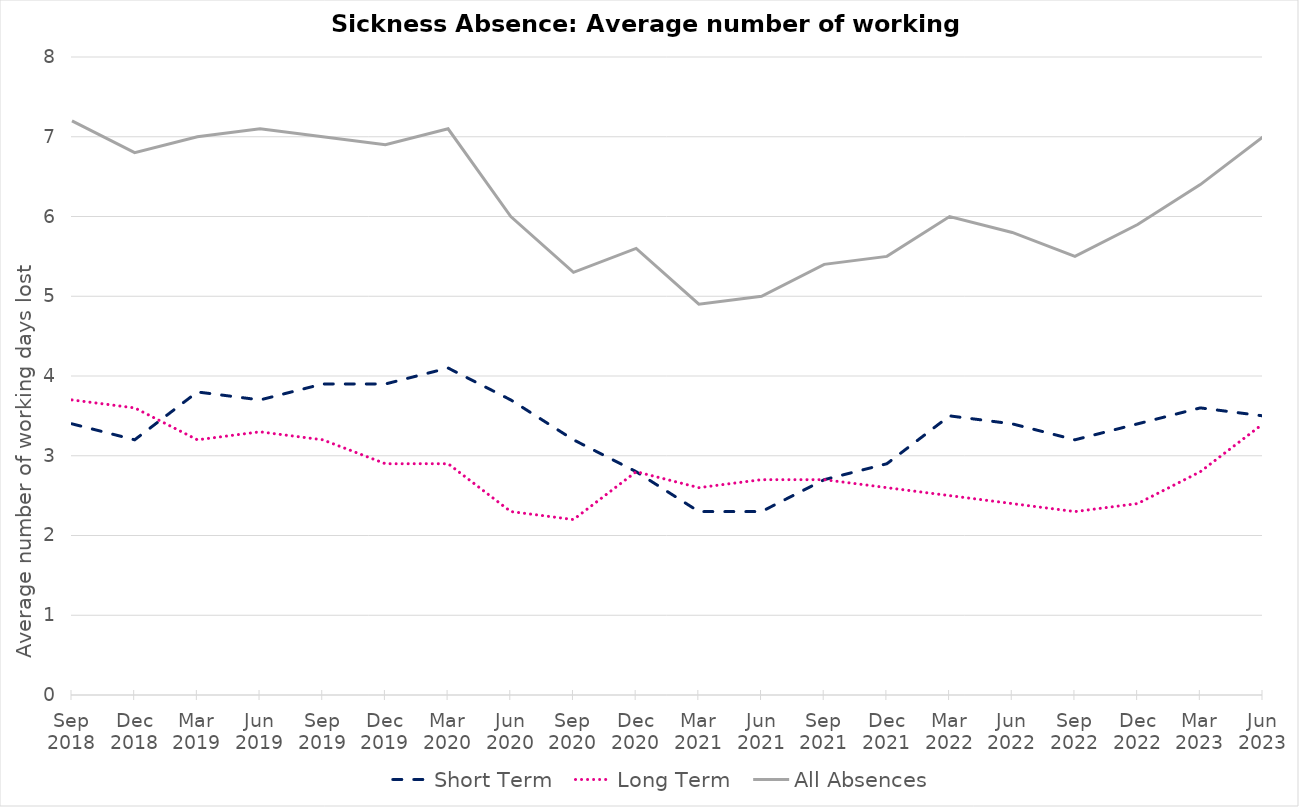
| Category | Short Term  | Long Term  | All Absences |
|---|---|---|---|
| Sep 2018 | 3.4 | 3.7 | 7.2 |
| Dec 2018 | 3.2 | 3.6 | 6.8 |
| Mar 2019 | 3.8 | 3.2 | 7 |
| Jun 2019 | 3.7 | 3.3 | 7.1 |
| Sep 2019 | 3.9 | 3.2 | 7 |
| Dec 2019 | 3.9 | 2.9 | 6.9 |
| Mar 2020 | 4.1 | 2.9 | 7.1 |
| Jun 2020 | 3.7 | 2.3 | 6 |
| Sep 2020 | 3.2 | 2.2 | 5.3 |
| Dec 2020 | 2.8 | 2.8 | 5.6 |
| Mar 2021 | 2.3 | 2.6 | 4.9 |
| Jun 2021 | 2.3 | 2.7 | 5 |
| Sep 2021 | 2.7 | 2.7 | 5.4 |
| Dec 2021 | 2.9 | 2.6 | 5.5 |
| Mar 2022 | 3.5 | 2.5 | 6 |
| Jun 2022 | 3.4 | 2.4 | 5.8 |
| Sep 2022 | 3.2 | 2.3 | 5.5 |
| Dec 2022 | 3.4 | 2.4 | 5.9 |
| Mar 2023 | 3.6 | 2.8 | 6.4 |
| Jun 2023 | 3.5 | 3.4 | 7 |